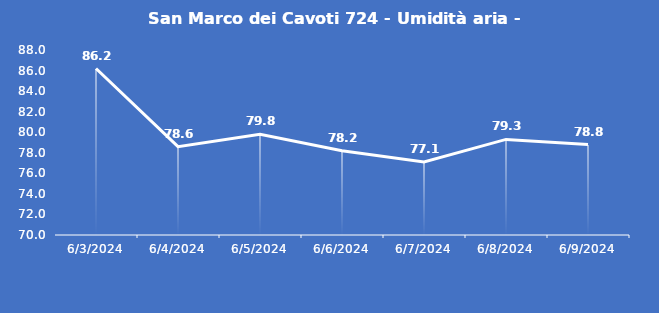
| Category | San Marco dei Cavoti 724 - Umidità aria - Grezzo (%) |
|---|---|
| 6/3/24 | 86.2 |
| 6/4/24 | 78.6 |
| 6/5/24 | 79.8 |
| 6/6/24 | 78.2 |
| 6/7/24 | 77.1 |
| 6/8/24 | 79.3 |
| 6/9/24 | 78.8 |